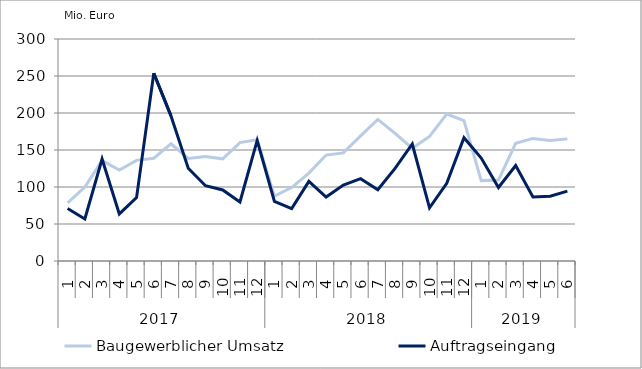
| Category | Baugewerblicher Umsatz | Auftragseingang |
|---|---|---|
| 0 | 78446.78 | 70908.903 |
| 1 | 99841.908 | 56868.408 |
| 2 | 135679.867 | 137790.423 |
| 3 | 123004.403 | 63637.761 |
| 4 | 136010.071 | 85644.63 |
| 5 | 138859.308 | 253791.552 |
| 6 | 158353.879 | 196034.198 |
| 7 | 138510.315 | 125319.873 |
| 8 | 141109.925 | 101690.626 |
| 9 | 138067.098 | 95966.626 |
| 10 | 160064.454 | 79701.993 |
| 11 | 163969.017 | 162878.607 |
| 12 | 87640.529 | 80684.627 |
| 13 | 99259.455 | 70746.763 |
| 14 | 118764.324 | 107538.747 |
| 15 | 143144.178 | 86374.619 |
| 16 | 146070.782 | 102661.329 |
| 17 | 169150.753 | 111287.709 |
| 18 | 191277.885 | 96286.662 |
| 19 | 172425.535 | 125142.495 |
| 20 | 152354.98 | 158112.302 |
| 21 | 168372.756 | 71808.619 |
| 22 | 198558.472 | 104904.147 |
| 23 | 189665.914 | 166653.461 |
| 24 | 108616.605 | 139065.287 |
| 25 | 109331.58 | 99318.609 |
| 26 | 159117.81 | 129002.041 |
| 27 | 165654.287 | 86579.2 |
| 28 | 162976.056 | 87644.362 |
| 29 | 165026.188 | 94463.186 |